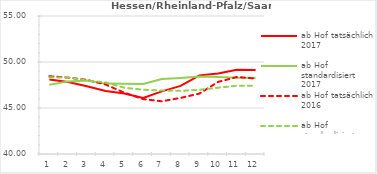
| Category | ab Hof tatsächlich 2017 | ab Hof standardisiert 2017 | ab Hof tatsächlich 2016 | ab Hof standardisiert 2016 |
|---|---|---|---|---|
| 0 | 48.099 | 47.525 | 48.457 | 48.33 |
| 1 | 47.826 | 47.893 | 48.303 | 48.324 |
| 2 | 47.357 | 47.984 | 48.06 | 47.99 |
| 3 | 46.849 | 47.651 | 47.547 | 47.779 |
| 4 | 46.584 | 47.645 | 46.663 | 47.197 |
| 5 | 46.094 | 47.602 | 45.964 | 46.988 |
| 6 | 46.812 | 48.156 | 45.73 | 46.895 |
| 7 | 47.407 | 48.269 | 46.102 | 46.861 |
| 8 | 48.546 | 48.416 | 46.565 | 46.982 |
| 9 | 48.753 | 48.357 | 47.836 | 47.204 |
| 10 | 49.158 | 48.301 | 48.371 | 47.421 |
| 11 | 49.124 | 48.27 | 48.205 | 47.434 |